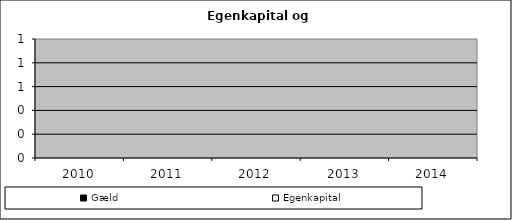
| Category | Egenkapital | Gæld |
|---|---|---|
| 2010.0 | 0 | 0 |
| 2011.0 | 0 | 0 |
| 2012.0 | 0 | 0 |
| 2013.0 | 0 | 0 |
| 2014.0 | 0 | 0 |